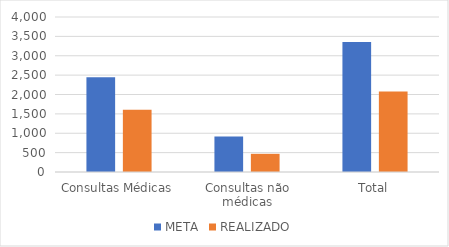
| Category | META | REALIZADO |
|---|---|---|
| Consultas Médicas | 2442 | 1607 |
| Consultas não médicas | 916 | 469 |
| Total | 3358 | 2076 |